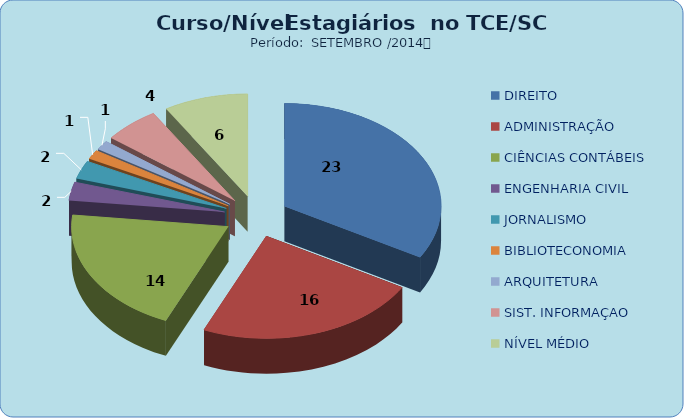
| Category | Series 0 |
|---|---|
| DIREITO | 23 |
| ADMINISTRAÇÃO | 16 |
| CIÊNCIAS CONTÁBEIS | 14 |
| ENGENHARIA CIVIL | 2 |
| JORNALISMO | 2 |
| BIBLIOTECONOMIA | 1 |
| ARQUITETURA | 1 |
| SIST. INFORMAÇAO | 4 |
| NÍVEL MÉDIO | 6 |